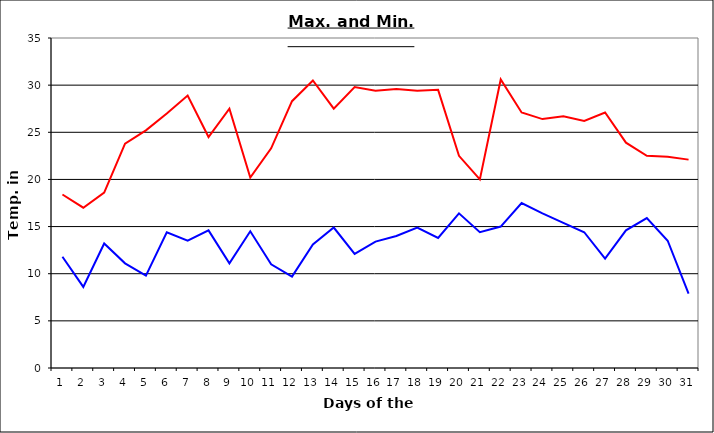
| Category | Series 0 | Series 1 |
|---|---|---|
| 0 | 18.4 | 11.8 |
| 1 | 17 | 8.6 |
| 2 | 18.6 | 13.2 |
| 3 | 23.8 | 11.1 |
| 4 | 25.2 | 9.8 |
| 5 | 27 | 14.4 |
| 6 | 28.9 | 13.5 |
| 7 | 24.5 | 14.6 |
| 8 | 27.5 | 11.1 |
| 9 | 20.2 | 14.5 |
| 10 | 23.3 | 11 |
| 11 | 28.3 | 9.7 |
| 12 | 30.5 | 13.1 |
| 13 | 27.5 | 14.9 |
| 14 | 29.8 | 12.1 |
| 15 | 29.4 | 13.4 |
| 16 | 29.6 | 14 |
| 17 | 29.4 | 14.9 |
| 18 | 29.5 | 13.8 |
| 19 | 22.5 | 16.4 |
| 20 | 20 | 14.4 |
| 21 | 30.6 | 15 |
| 22 | 27.1 | 17.5 |
| 23 | 26.4 | 16.4 |
| 24 | 26.7 | 15.4 |
| 25 | 26.2 | 14.4 |
| 26 | 27.1 | 11.6 |
| 27 | 23.9 | 14.6 |
| 28 | 22.5 | 15.9 |
| 29 | 22.4 | 13.5 |
| 30 | 22.1 | 7.9 |